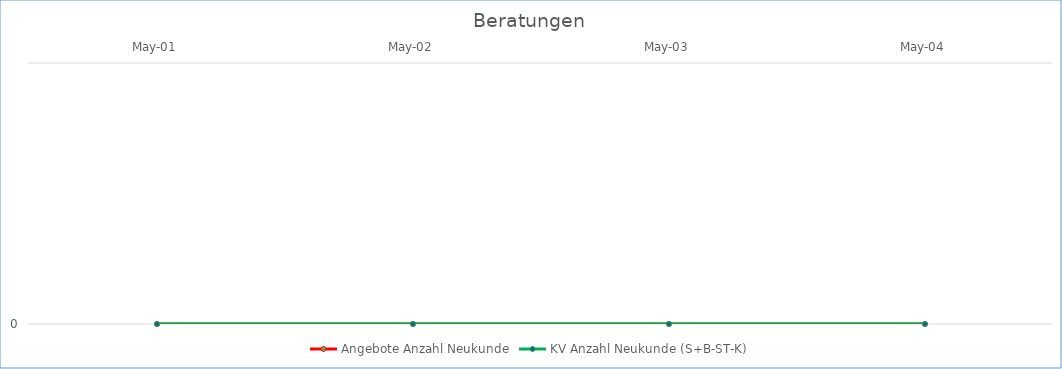
| Category | Angebote Anzahl Neukunde | KV Anzahl Neukunde (S+B-ST-K) |
|---|---|---|
| 2001-05-01 | 0 | 0 |
| 2002-05-01 | 0 | 0 |
| 2003-05-01 | 0 | 0 |
| 2004-05-01 | 0 | 0 |